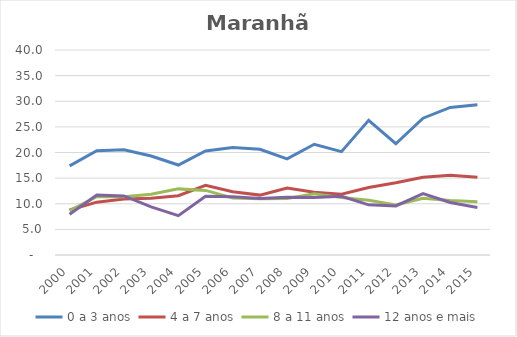
| Category | 0 a 3 anos | 4 a 7 anos | 8 a 11 anos | 12 anos e mais |
|---|---|---|---|---|
| 2000.0 | 17.385 | 8.781 | 8.677 | 7.959 |
| 2001.0 | 20.345 | 10.307 | 11.384 | 11.697 |
| 2002.0 | 20.514 | 10.914 | 11.354 | 11.521 |
| 2003.0 | 19.307 | 11.096 | 11.869 | 9.389 |
| 2004.0 | 17.553 | 11.566 | 12.902 | 7.681 |
| 2005.0 | 20.306 | 13.589 | 12.601 | 11.452 |
| 2006.0 | 20.963 | 12.352 | 11.131 | 11.348 |
| 2007.0 | 20.641 | 11.685 | 10.961 | 11.019 |
| 2008.0 | 18.758 | 13.086 | 11.021 | 11.255 |
| 2009.0 | 21.606 | 12.265 | 11.95 | 11.238 |
| 2010.0 | 20.173 | 11.868 | 11.198 | 11.467 |
| 2011.0 | 26.291 | 13.166 | 10.7 | 9.79 |
| 2012.0 | 21.712 | 14.09 | 9.769 | 9.574 |
| 2013.0 | 26.699 | 15.179 | 11.054 | 11.976 |
| 2014.0 | 28.785 | 15.555 | 10.642 | 10.246 |
| 2015.0 | 29.305 | 15.151 | 10.381 | 9.278 |